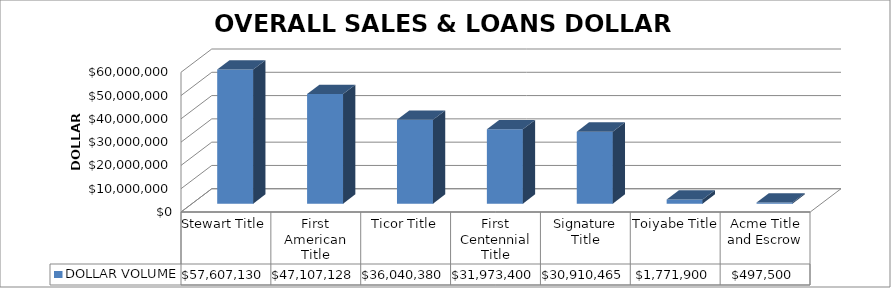
| Category | DOLLAR VOLUME |
|---|---|
| Stewart Title | 57607130 |
| First American Title | 47107128 |
| Ticor Title | 36040379.73 |
| First Centennial Title | 31973400 |
| Signature Title | 30910465 |
| Toiyabe Title | 1771900 |
| Acme Title and Escrow | 497500 |